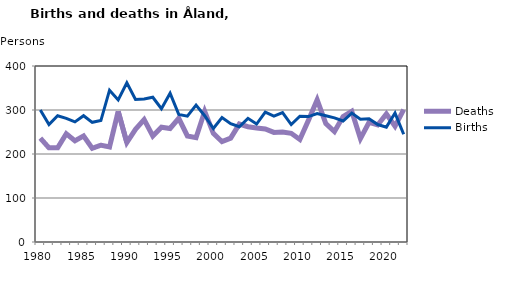
| Category | Deaths | Births |
|---|---|---|
| 1980.0 | 236 | 300 |
| 1981.0 | 214 | 267 |
| 1982.0 | 214 | 287 |
| 1983.0 | 246 | 281 |
| 1984.0 | 230 | 273 |
| 1985.0 | 241 | 287 |
| 1986.0 | 213 | 272 |
| 1987.0 | 220 | 276 |
| 1988.0 | 216 | 345 |
| 1989.0 | 297 | 323 |
| 1990.0 | 226 | 362 |
| 1991.0 | 256 | 324 |
| 1992.0 | 278 | 325 |
| 1993.0 | 241 | 329 |
| 1994.0 | 261 | 303 |
| 1995.0 | 258 | 338 |
| 1996.0 | 281 | 290 |
| 1997.0 | 241 | 286 |
| 1998.0 | 237 | 311 |
| 1999.0 | 297 | 287 |
| 2000.0 | 247 | 258 |
| 2001.0 | 228 | 283 |
| 2002.0 | 236 | 269 |
| 2003.0 | 268 | 262 |
| 2004.0 | 262 | 281 |
| 2005.0 | 259 | 268 |
| 2006.0 | 257 | 295 |
| 2007.0 | 249 | 286 |
| 2008.0 | 250 | 294 |
| 2009.0 | 247 | 267 |
| 2010.0 | 233 | 286 |
| 2011.0 | 277 | 285 |
| 2012.0 | 323 | 292 |
| 2013.0 | 269 | 287 |
| 2014.0 | 251 | 282 |
| 2015.0 | 285 | 275 |
| 2016.0 | 297 | 293 |
| 2017.0 | 235 | 279 |
| 2018.0 | 272 | 280 |
| 2019.0 | 266 | 267 |
| 2020.0 | 291 | 261 |
| 2021.0 | 263 | 293 |
| 2022.0 | 301 | 245 |